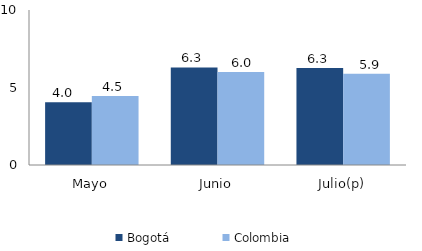
| Category | Bogotá | Colombia |
|---|---|---|
| Mayo | 4.049 | 4.46 |
| Junio | 6.291 | 6.006 |
| Julio(p) | 6.256 | 5.879 |